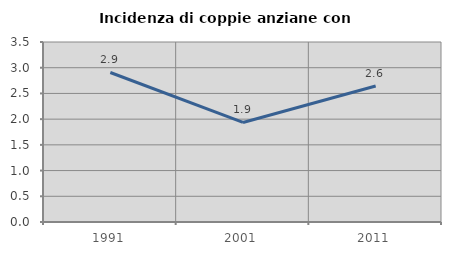
| Category | Incidenza di coppie anziane con figli |
|---|---|
| 1991.0 | 2.907 |
| 2001.0 | 1.935 |
| 2011.0 | 2.646 |